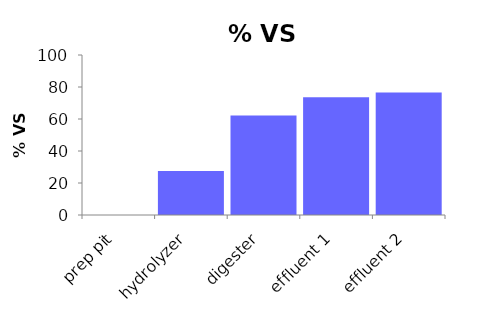
| Category | % VS destroyed |
|---|---|
| prep pit | 0 |
| hydrolyzer | 27.539 |
| digester | 62.21 |
| effluent 1 | 73.641 |
| effluent 2 | 76.55 |